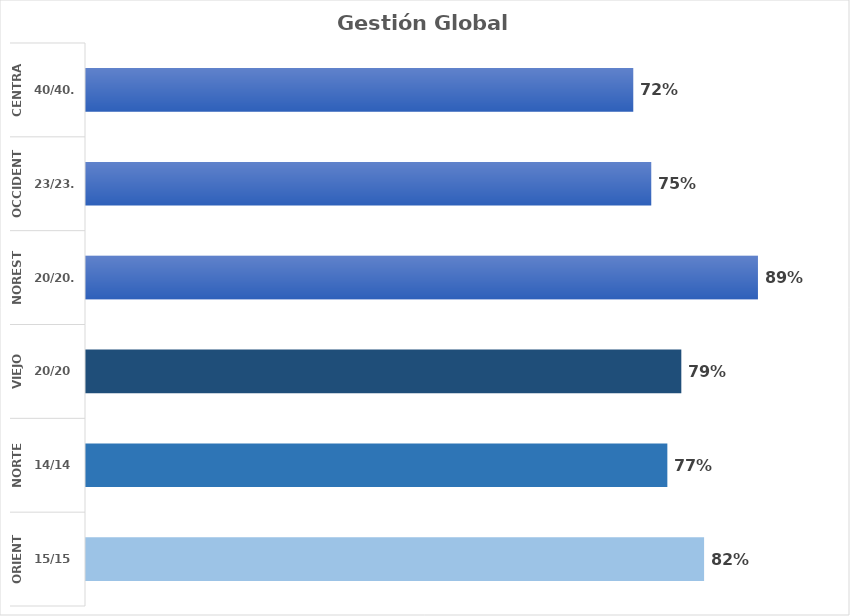
| Category | Series 0 |
|---|---|
| 0 | 0.819 |
| 1 | 0.77 |
| 2 | 0.788 |
| 3 | 0.89 |
| 4 | 0.749 |
| 5 | 0.725 |